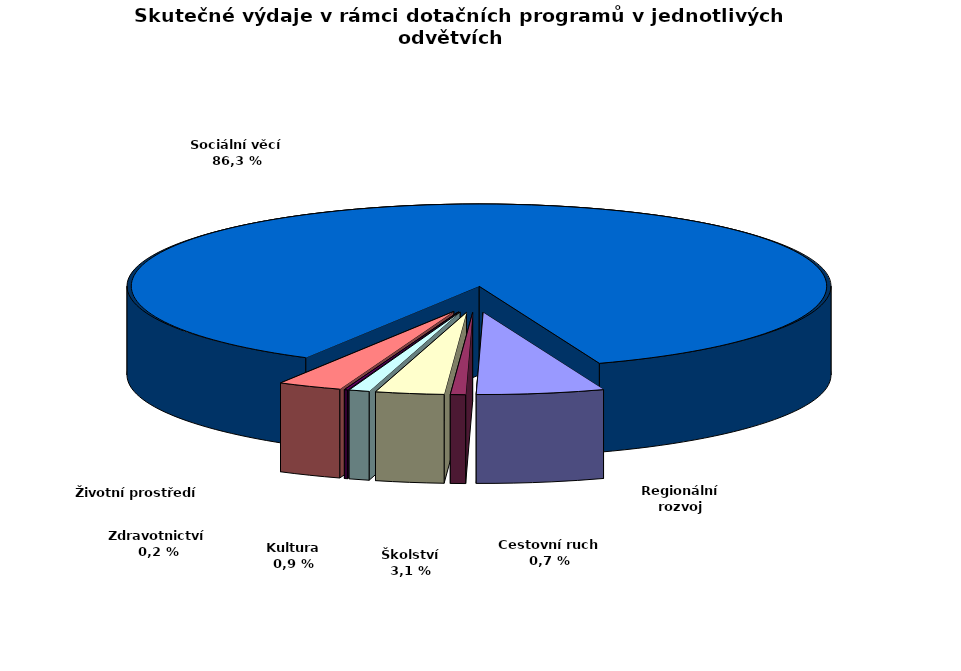
| Category | Series 0 |
|---|---|
| Regionální rozvoj | 78324.56 |
| Cestovní ruch | 9293.08 |
| Školství | 42015.41 |
| Kultura | 12572.39 |
| Zdravotnictví | 1974.75 |
| Životní prostředí  | 39233.28 |
| Sociální věcí | 1150678.06 |